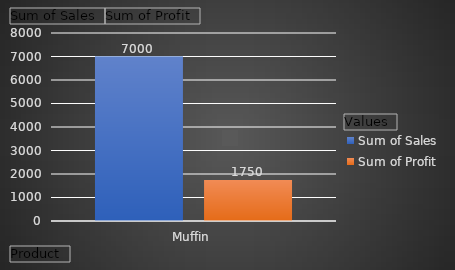
| Category | Sum of Sales | Sum of Profit |
|---|---|---|
| Muffin | 7000 | 1750 |